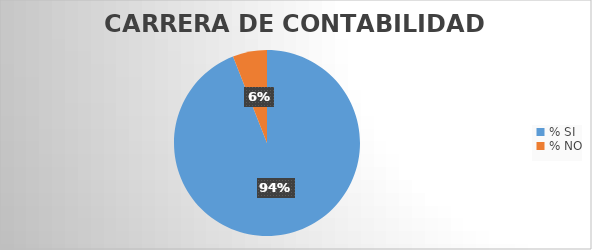
| Category | Series 0 |
|---|---|
| % SI | 94.048 |
| % NO | 5.952 |